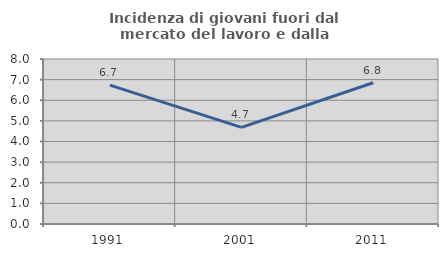
| Category | Incidenza di giovani fuori dal mercato del lavoro e dalla formazione  |
|---|---|
| 1991.0 | 6.735 |
| 2001.0 | 4.684 |
| 2011.0 | 6.848 |